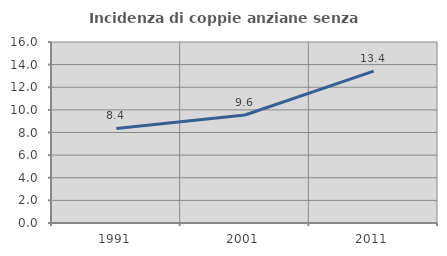
| Category | Incidenza di coppie anziane senza figli  |
|---|---|
| 1991.0 | 8.357 |
| 2001.0 | 9.551 |
| 2011.0 | 13.425 |